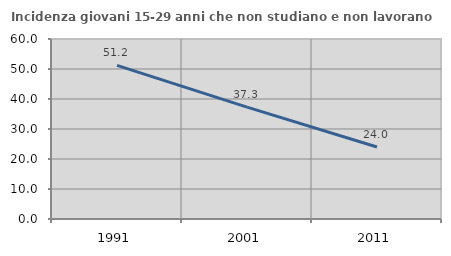
| Category | Incidenza giovani 15-29 anni che non studiano e non lavorano  |
|---|---|
| 1991.0 | 51.19 |
| 2001.0 | 37.311 |
| 2011.0 | 24.007 |